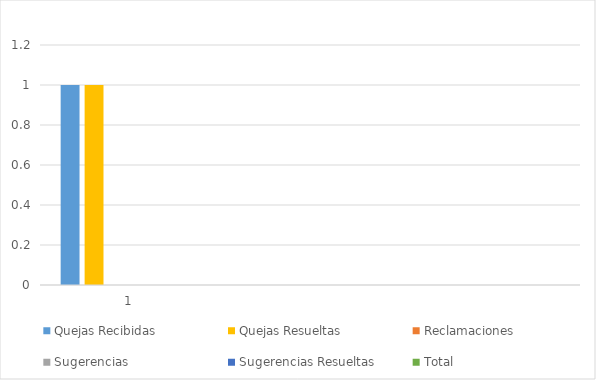
| Category | Quejas Recibidas | Quejas Resueltas | Reclamaciones | Sugerencias | Sugerencias Resueltas | Total |
|---|---|---|---|---|---|---|
| 1.0 | 1 | 1 | 0 | 0 | 0 | 0 |